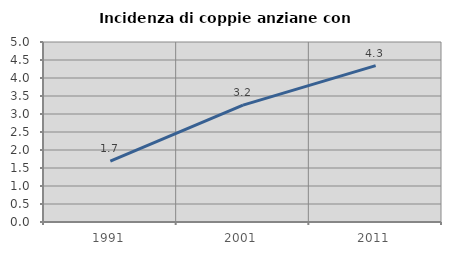
| Category | Incidenza di coppie anziane con figli |
|---|---|
| 1991.0 | 1.69 |
| 2001.0 | 3.246 |
| 2011.0 | 4.344 |